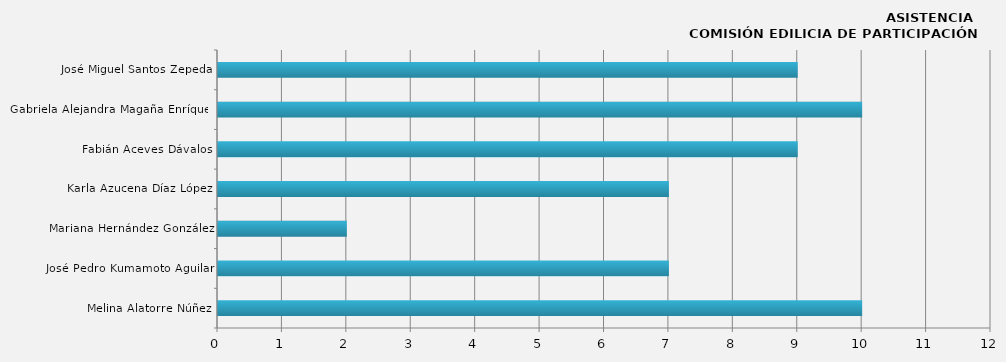
| Category | Series 0 |
|---|---|
| Melina Alatorre Núñez | 10 |
| José Pedro Kumamoto Aguilar | 7 |
| Mariana Hernández González | 2 |
| Karla Azucena Díaz López | 7 |
| Fabián Aceves Dávalos | 9 |
| Gabriela Alejandra Magaña Enríquez | 10 |
| José Miguel Santos Zepeda | 9 |